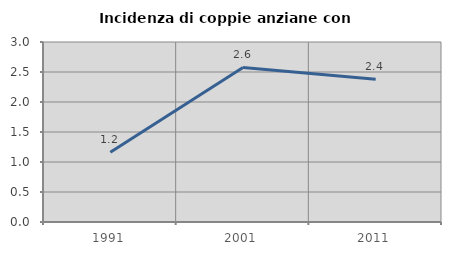
| Category | Incidenza di coppie anziane con figli |
|---|---|
| 1991.0 | 1.163 |
| 2001.0 | 2.576 |
| 2011.0 | 2.38 |